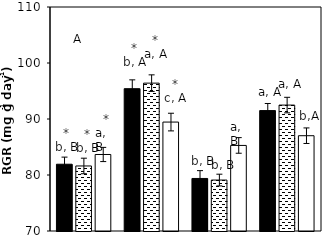
| Category |    A. brasilense |    A. chroococcum |    CK |
|---|---|---|---|
| aCO2-Bt | 81.925 | 81.614 | 83.663 |
| aCO2-XIANYU | 95.415 | 96.404 | 89.452 |
| eCO2-Bt | 79.383 | 79.096 | 85.28 |
| eCO2-XIANYU | 91.503 | 92.486 | 87.017 |